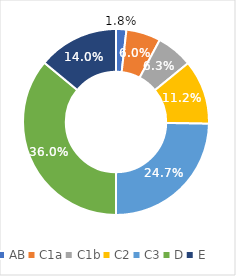
| Category | Series 0 |
|---|---|
| AB | 0.018 |
| C1a | 0.06 |
| C1b | 0.063 |
| C2 | 0.112 |
| C3 | 0.247 |
| D | 0.36 |
| E | 0.14 |